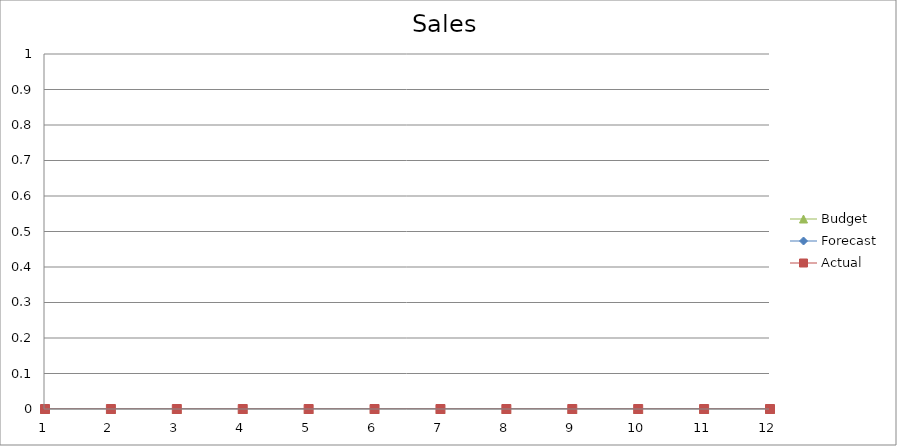
| Category | Budget | Forecast | Actual |
|---|---|---|---|
| 0 | 3070 | 1740 | 2000 |
| 1 | 1520 | 2030 | 1610 |
| 2 | 2010 | 2050 | 3420 |
| 3 | 2870 | 2180 | 820 |
| 4 | 1860 | 1560 | 3330 |
| 5 | 2610 | 1730 | 3430 |
| 6 | 1610 | 3230 | 3340 |
| 7 | 2260 | 1650 | 3200 |
| 8 | 3370 | 3490 | 1840 |
| 9 | 1260 | 790 | 2090 |
| 10 | 1260 | 500 | 3190 |
| 11 | 1200 | 2990 | 2000 |